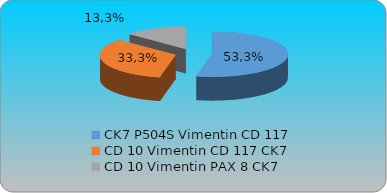
| Category | Series 0 | Series 1 | Series 2 | Series 3 |
|---|---|---|---|---|
| CK7 P504S Vimentin CD 117  | 0.533 |  |  |  |
| CD 10 Vimentin CD 117 CK7  | 0.333 |  |  |  |
| CD 10 Vimentin PAX 8 CK7 | 0.133 |  |  |  |